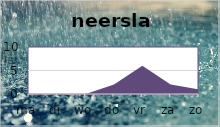
| Category | neerslag |
|---|---|
| ma | 0 |
| di | 0 |
| wo | 0 |
| do | 2 |
| vr | 6 |
| za | 2 |
| zo | 1 |